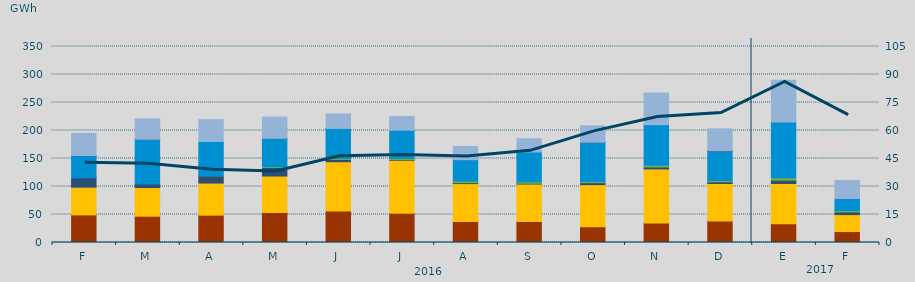
| Category | Carbón | Ciclo Combinado | Cogeneración | Consumo Bombeo | Eólica | Fuel-Gas | Hidráulica | Nuclear | Turbinación bombeo |
|---|---|---|---|---|---|---|---|---|---|
| F | 49270.8 | 49534.1 | 0 | 16650.5 | 0 | 0 | 39582.6 | 315 | 39346.8 |
| M | 46981.5 | 51189.9 | 0 | 6160.8 | 0 | 0 | 79699.3 | 394.1 | 36350.1 |
| A | 48797.4 | 57355.9 | 0 | 12859 | 204.7 | 0 | 61249.4 | 0 | 38883.7 |
| M | 53629.9 | 65079.6 | 0 | 15177.5 | 1551.4 | 0 | 50504.5 | 57 | 37889.8 |
| J | 56105.7 | 88155 | 0 | 4098 | 1765.6 | 0 | 53472.5 | 75 | 25898.4 |
| J | 52336 | 94541.2 | 0 | 1399.6 | 1952.7 | 0 | 50314 | 0 | 24575.3 |
| A | 37334.5 | 67871 | 0 | 1577.6 | 2939.5 | 0 | 37964.3 | 25 | 23687.2 |
| S | 37698.5 | 66682.3 | 0 | 1355 | 2661.1 | 0 | 53272.9 | 0 | 23588.2 |
| O | 28157.6 | 75179.9 | 2.2 | 3499.1 | 2164.7 | 0 | 70061.5 | 21.9 | 29280.6 |
| N | 34938.5 | 96462 | 10.5 | 3432.1 | 3197.2 | 0 | 72313.8 | 0 | 56573.1 |
| D | 38367.5 | 66989.6 | 22.7 | 3010.5 | 2208.6 | 0 | 52585.3 | 619.5 | 39099.8 |
| E | 33693.8 | 71645.3 | 16.3 | 5899.1 | 4288.7 | 0 | 99664.7 | 0 | 74414.2 |
| F | 19518.4 | 30319.3 | 9.6 | 4595.7 | 2486.3 | 0 | 21689.9 | 0 | 32220.5 |